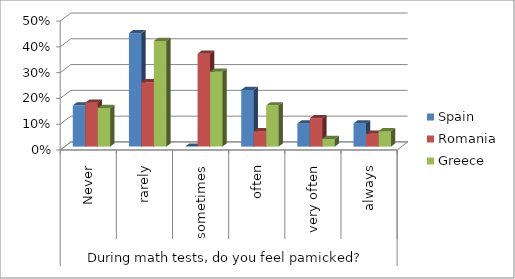
| Category | Spain | Romania | Greece |
|---|---|---|---|
| 0 | 0.16 | 0.17 | 0.15 |
| 1 | 0.44 | 0.25 | 0.41 |
| 2 | 0 | 0.36 | 0.29 |
| 3 | 0.22 | 0.06 | 0.16 |
| 4 | 0.09 | 0.11 | 0.03 |
| 5 | 0.09 | 0.05 | 0.06 |